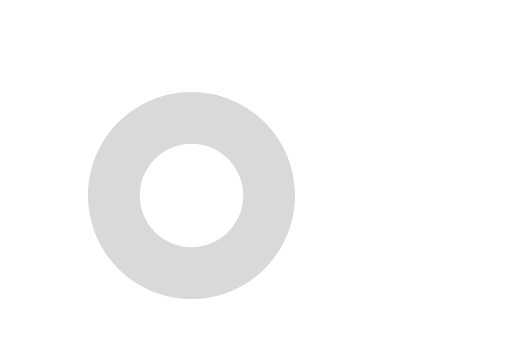
| Category | Series 0 |
|---|---|
| Yes | 0 |
| No | 0 |
| Unanswered | 200 |